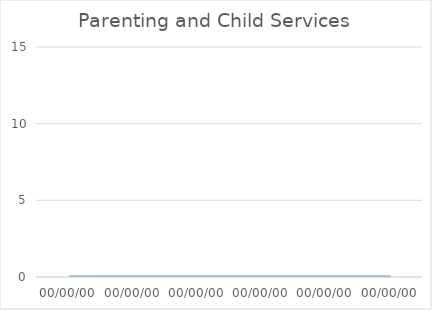
| Category | Parenting and Child Services |
|---|---|
| 00/00/00 | 0 |
| 00/00/00 | 0 |
| 00/00/00 | 0 |
| 00/00/00 | 0 |
| 00/00/00 | 0 |
| 00/00/00 | 0 |